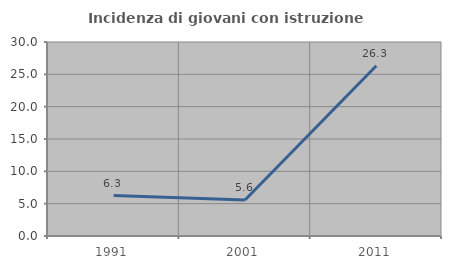
| Category | Incidenza di giovani con istruzione universitaria |
|---|---|
| 1991.0 | 6.25 |
| 2001.0 | 5.556 |
| 2011.0 | 26.316 |